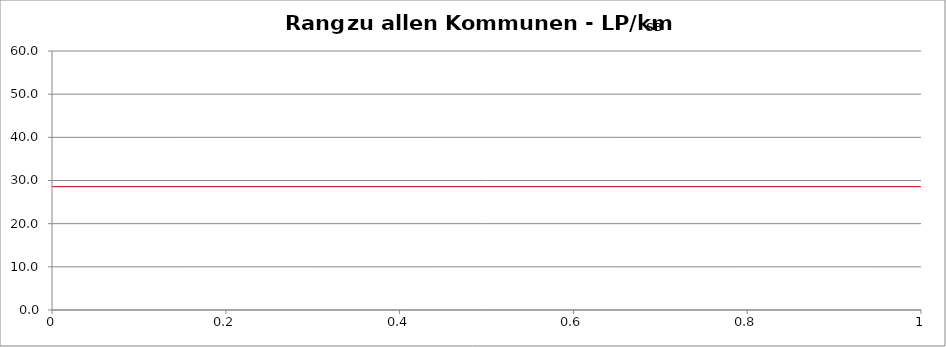
| Category | Kommunenrangfolge |
|---|---|
| 0 | 0.306 |
| 1 | 3.086 |
| 2 | 5.5 |
| 3 | 10.118 |
| 4 | 10.4 |
| 5 | 13 |
| 6 | 13.206 |
| 7 | 13.429 |
| 8 | 13.75 |
| 9 | 13.778 |
| 10 | 14 |
| 11 | 14 |
| 12 | 14 |
| 13 | 14 |
| 14 | 14.014 |
| 15 | 14.083 |
| 16 | 14.333 |
| 17 | 14.5 |
| 18 | 14.583 |
| 19 | 14.84 |
| 20 | 15 |
| 21 | 15 |
| 22 | 15.25 |
| 23 | 15.333 |
| 24 | 15.5 |
| 25 | 15.621 |
| 26 | 16 |
| 27 | 16 |
| 28 | 16 |
| 29 | 16 |
| 30 | 16.75 |
| 31 | 16.849 |
| 32 | 16.883 |
| 33 | 17 |
| 34 | 17.2 |
| 35 | 17.8 |
| 36 | 18 |
| 37 | 18 |
| 38 | 18.333 |
| 39 | 18.65 |
| 40 | 18.667 |
| 41 | 18.75 |
| 42 | 18.76 |
| 43 | 19 |
| 44 | 19 |
| 45 | 19 |
| 46 | 19.143 |
| 47 | 19.25 |
| 48 | 19.444 |
| 49 | 19.5 |
| 50 | 19.667 |
| 51 | 19.667 |
| 52 | 19.667 |
| 53 | 20 |
| 54 | 20 |
| 55 | 20 |
| 56 | 20.208 |
| 57 | 20.3 |
| 58 | 20.556 |
| 59 | 20.619 |
| 60 | 20.833 |
| 61 | 21 |
| 62 | 21 |
| 63 | 21 |
| 64 | 21.5 |
| 65 | 21.571 |
| 66 | 21.66 |
| 67 | 21.908 |
| 68 | 22 |
| 69 | 22.222 |
| 70 | 22.222 |
| 71 | 22.312 |
| 72 | 22.331 |
| 73 | 22.381 |
| 74 | 22.429 |
| 75 | 22.471 |
| 76 | 22.5 |
| 77 | 22.667 |
| 78 | 22.8 |
| 79 | 23 |
| 80 | 23 |
| 81 | 23 |
| 82 | 23 |
| 83 | 23.125 |
| 84 | 23.136 |
| 85 | 23.289 |
| 86 | 23.5 |
| 87 | 23.5 |
| 88 | 23.667 |
| 89 | 23.72 |
| 90 | 23.75 |
| 91 | 24 |
| 92 | 24.25 |
| 93 | 24.333 |
| 94 | 24.4 |
| 95 | 24.5 |
| 96 | 24.667 |
| 97 | 25 |
| 98 | 25 |
| 99 | 25 |
| 100 | 25 |
| 101 | 25 |
| 102 | 25 |
| 103 | 25.1 |
| 104 | 25.1 |
| 105 | 25.2 |
| 106 | 25.301 |
| 107 | 25.429 |
| 108 | 25.462 |
| 109 | 25.5 |
| 110 | 25.522 |
| 111 | 25.6 |
| 112 | 25.667 |
| 113 | 25.747 |
| 114 | 25.75 |
| 115 | 25.8 |
| 116 | 25.918 |
| 117 | 25.982 |
| 118 | 26 |
| 119 | 26 |
| 120 | 26 |
| 121 | 26.25 |
| 122 | 26.333 |
| 123 | 26.556 |
| 124 | 26.6 |
| 125 | 26.75 |
| 126 | 26.875 |
| 127 | 26.875 |
| 128 | 27 |
| 129 | 27.083 |
| 130 | 27.136 |
| 131 | 27.25 |
| 132 | 27.333 |
| 133 | 27.333 |
| 134 | 27.5 |
| 135 | 27.5 |
| 136 | 27.6 |
| 137 | 27.633 |
| 138 | 27.68 |
| 139 | 28 |
| 140 | 28 |
| 141 | 28 |
| 142 | 28 |
| 143 | 28.143 |
| 144 | 28.31 |
| 145 | 28.35 |
| 146 | 28.444 |
| 147 | 28.711 |
| 148 | 28.938 |
| 149 | 28.947 |
| 150 | 29 |
| 151 | 29.121 |
| 152 | 29.2 |
| 153 | 29.225 |
| 154 | 29.333 |
| 155 | 29.667 |
| 156 | 29.767 |
| 157 | 29.833 |
| 158 | 30 |
| 159 | 30 |
| 160 | 30 |
| 161 | 30.175 |
| 162 | 30.25 |
| 163 | 30.381 |
| 164 | 30.556 |
| 165 | 30.667 |
| 166 | 30.909 |
| 167 | 31 |
| 168 | 31.25 |
| 169 | 31.429 |
| 170 | 31.5 |
| 171 | 31.875 |
| 172 | 32 |
| 173 | 32.073 |
| 174 | 32.1 |
| 175 | 32.286 |
| 176 | 32.4 |
| 177 | 32.5 |
| 178 | 32.931 |
| 179 | 33 |
| 180 | 33 |
| 181 | 33.2 |
| 182 | 33.275 |
| 183 | 33.3 |
| 184 | 33.389 |
| 185 | 33.824 |
| 186 | 34.4 |
| 187 | 34.5 |
| 188 | 34.615 |
| 189 | 35 |
| 190 | 35 |
| 191 | 35 |
| 192 | 35.144 |
| 193 | 35.167 |
| 194 | 35.764 |
| 195 | 35.8 |
| 196 | 36.125 |
| 197 | 36.667 |
| 198 | 36.667 |
| 199 | 38.6 |
| 200 | 38.737 |
| 201 | 41.429 |
| 202 | 44 |
| 203 | 44.953 |
| 204 | 46.421 |
| 205 | 49.327 |
| 206 | 50.5 |
| 207 | 54 |
| 208 | 54.778 |
| 209 | 56 |